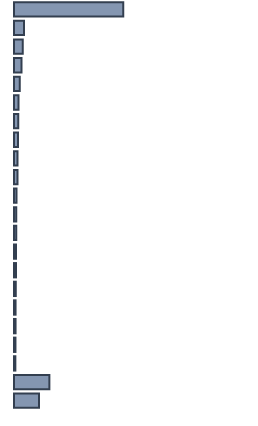
| Category | Percentatge |
|---|---|
| 0 | 45.522 |
| 1 | 4.13 |
| 2 | 3.696 |
| 3 | 3.13 |
| 4 | 2.348 |
| 5 | 1.87 |
| 6 | 1.739 |
| 7 | 1.696 |
| 8 | 1.435 |
| 9 | 1.435 |
| 10 | 1 |
| 11 | 0.957 |
| 12 | 0.957 |
| 13 | 0.87 |
| 14 | 0.826 |
| 15 | 0.739 |
| 16 | 0.652 |
| 17 | 0.652 |
| 18 | 0.609 |
| 19 | 0.565 |
| 20 | 14.739 |
| 21 | 10.435 |